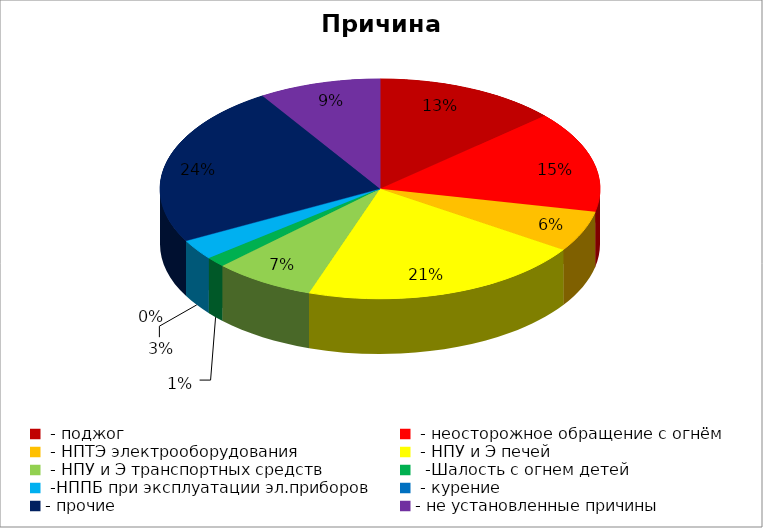
| Category | Причина пожара |
|---|---|
|  - поджог | 9 |
|  - неосторожное обращение с огнём | 10 |
|  - НПТЭ электрооборудования | 4 |
|  - НПУ и Э печей | 14 |
|  - НПУ и Э транспортных средств | 5 |
|   -Шалость с огнем детей | 1 |
|  -НППБ при эксплуатации эл.приборов | 2 |
|  - курение | 0 |
| - прочие | 16 |
| - не установленные причины | 6 |